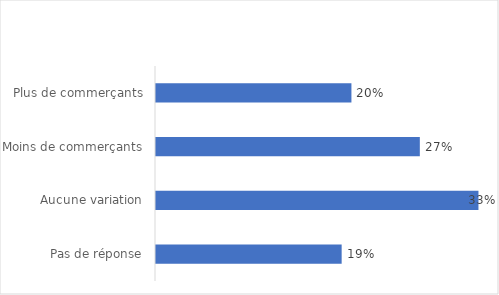
| Category | % |
|---|---|
| Pas de réponse | 0.19 |
| Aucune variation | 0.33 |
| Moins de commerçants | 0.27 |
| Plus de commerçants | 0.2 |